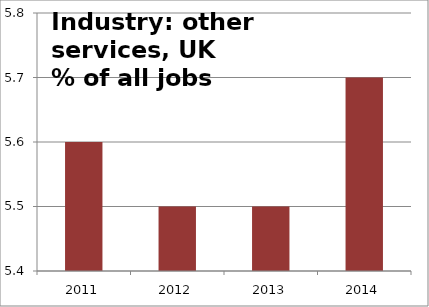
| Category | R-U: Other services  |
|---|---|
| 2011.0 | 5.6 |
| 2012.0 | 5.5 |
| 2013.0 | 5.5 |
| 2014.0 | 5.7 |